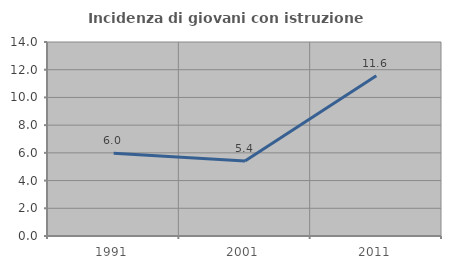
| Category | Incidenza di giovani con istruzione universitaria |
|---|---|
| 1991.0 | 5.97 |
| 2001.0 | 5.405 |
| 2011.0 | 11.57 |